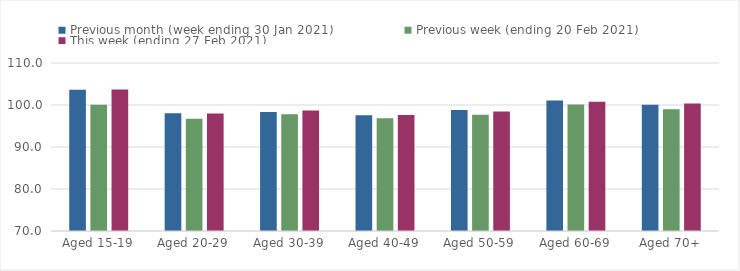
| Category | Previous month (week ending 30 Jan 2021) | Previous week (ending 20 Feb 2021) | This week (ending 27 Feb 2021) |
|---|---|---|---|
| Aged 15-19 | 103.66 | 100.03 | 103.68 |
| Aged 20-29 | 98.03 | 96.7 | 97.97 |
| Aged 30-39 | 98.33 | 97.77 | 98.67 |
| Aged 40-49 | 97.58 | 96.82 | 97.62 |
| Aged 50-59 | 98.83 | 97.69 | 98.47 |
| Aged 60-69 | 101.09 | 100.11 | 100.79 |
| Aged 70+ | 100.08 | 99 | 100.34 |